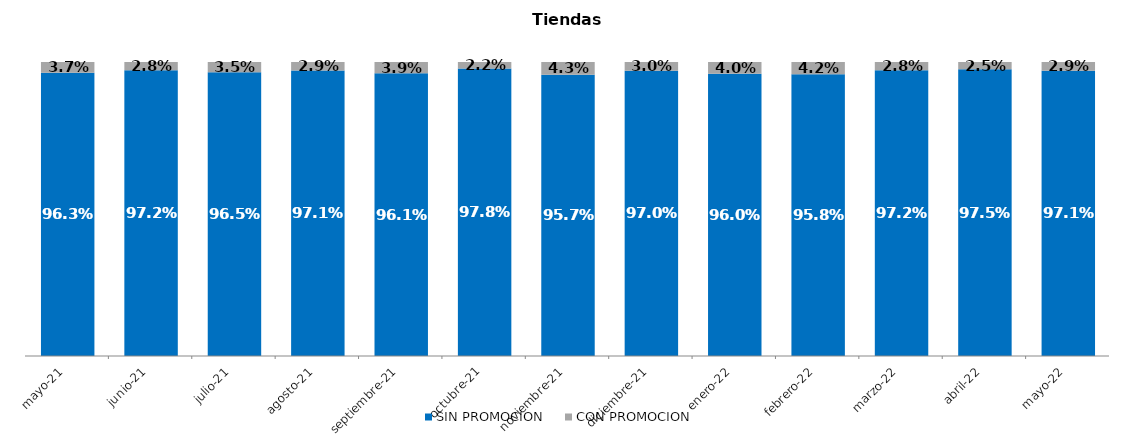
| Category | SIN PROMOCION   | CON PROMOCION   |
|---|---|---|
| 2021-05-01 | 0.963 | 0.037 |
| 2021-06-01 | 0.972 | 0.028 |
| 2021-07-01 | 0.965 | 0.035 |
| 2021-08-01 | 0.971 | 0.029 |
| 2021-09-01 | 0.961 | 0.039 |
| 2021-10-01 | 0.978 | 0.022 |
| 2021-11-01 | 0.957 | 0.043 |
| 2021-12-01 | 0.97 | 0.03 |
| 2022-01-01 | 0.96 | 0.04 |
| 2022-02-01 | 0.958 | 0.042 |
| 2022-03-01 | 0.972 | 0.028 |
| 2022-04-01 | 0.975 | 0.025 |
| 2022-05-01 | 0.971 | 0.029 |